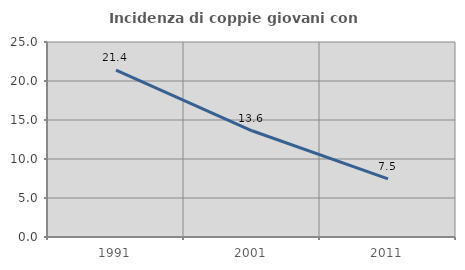
| Category | Incidenza di coppie giovani con figli |
|---|---|
| 1991.0 | 21.398 |
| 2001.0 | 13.619 |
| 2011.0 | 7.463 |